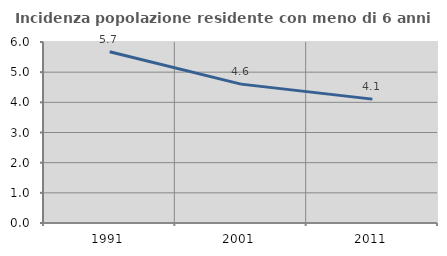
| Category | Incidenza popolazione residente con meno di 6 anni |
|---|---|
| 1991.0 | 5.676 |
| 2001.0 | 4.604 |
| 2011.0 | 4.106 |